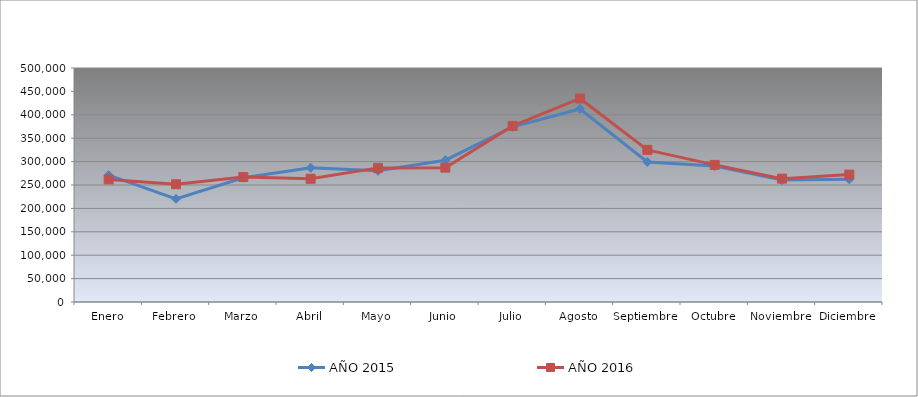
| Category | AÑO 2015 | AÑO 2016 |
|---|---|---|
| Enero | 271140 | 261940 |
| Febrero | 220460 | 251600 |
| Marzo | 265500 | 267040 |
| Abril | 286760 | 263340 |
| Mayo | 280280 | 286580 |
| Junio | 302980 | 287060 |
| Julio | 374300 | 376340 |
| Agosto | 412500 | 434900 |
| Septiembre | 299240 | 325080 |
| Octubre | 290440 | 293000 |
| Noviembre | 260600 | 263620 |
| Diciembre | 262100 | 272200 |